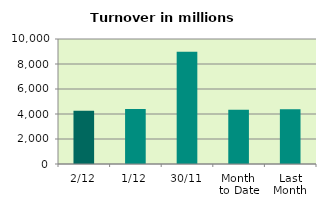
| Category | Series 0 |
|---|---|
| 2/12 | 4268.401 |
| 1/12 | 4404.469 |
| 30/11 | 8974.363 |
| Month 
to Date | 4336.435 |
| Last
Month | 4388.555 |